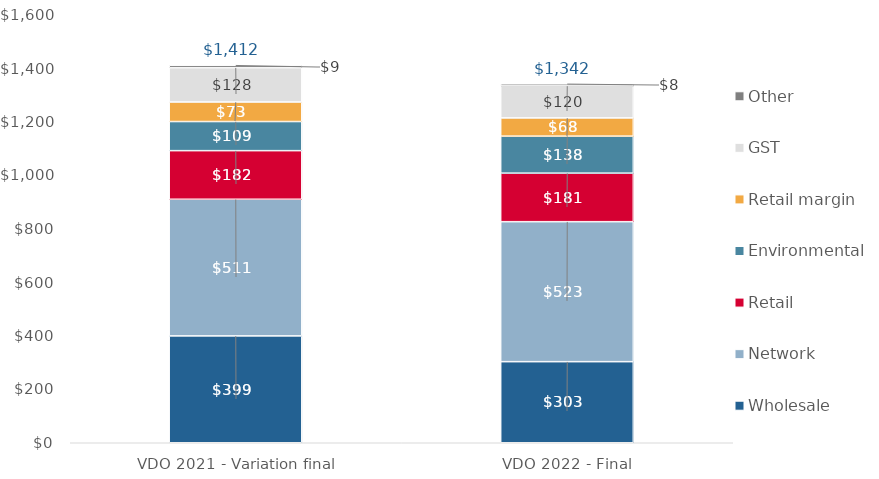
| Category | Wholesale | Network | Retail | Environmental | Retail margin | GST | Other |
|---|---|---|---|---|---|---|---|
| VDO 2021 - Variation final | 399.439 | 510.785 | 181.759 | 108.777 | 73.083 | 128.307 | 9.226 |
| VDO 2022 - Final | 303.142 | 523.315 | 181.376 | 138.333 | 68.154 | 119.653 | 7.824 |